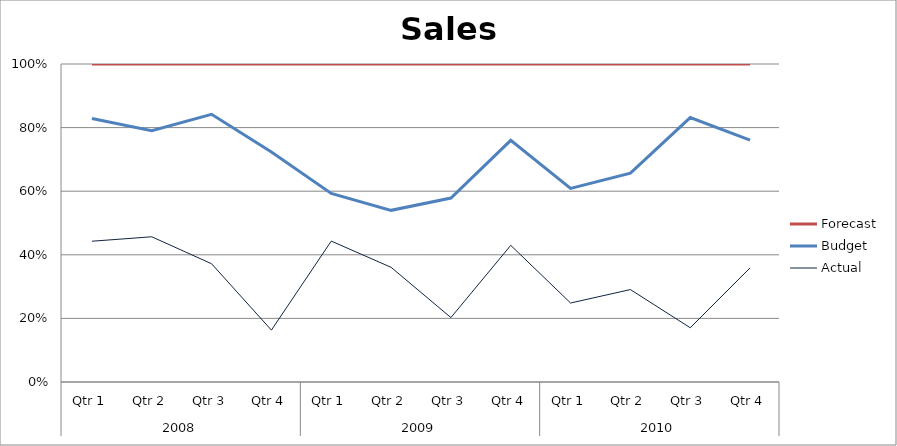
| Category | Actual | Budget | Forecast |
|---|---|---|---|
| 0 | 3360 | 2930 | 1300 |
| 1 | 2110 | 1540 | 970 |
| 2 | 2350 | 2970 | 1000 |
| 3 | 690 | 2370 | 1170 |
| 4 | 3190 | 1080 | 2930 |
| 5 | 1450 | 720 | 1850 |
| 6 | 1240 | 2300 | 2580 |
| 7 | 2720 | 2090 | 1520 |
| 8 | 1930 | 2800 | 3040 |
| 9 | 2430 | 3060 | 2870 |
| 10 | 800 | 3100 | 790 |
| 11 | 2670 | 2990 | 1780 |